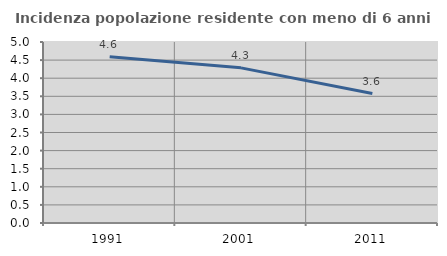
| Category | Incidenza popolazione residente con meno di 6 anni |
|---|---|
| 1991.0 | 4.595 |
| 2001.0 | 4.286 |
| 2011.0 | 3.577 |